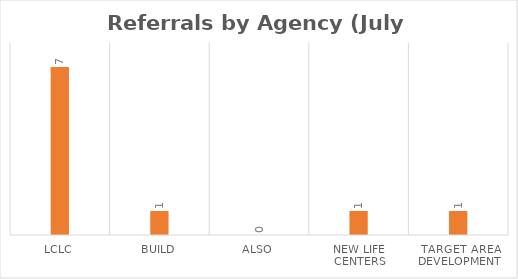
| Category | Series 0 |
|---|---|
| LCLC | 7 |
| BUILD | 1 |
| ALSO | 0 |
| New Life Centers | 1 |
| Target Area Development | 1 |